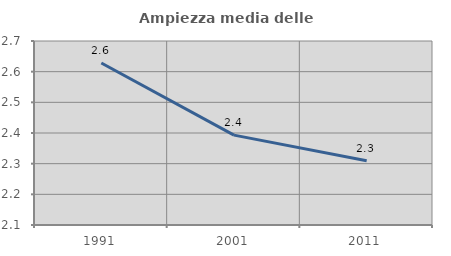
| Category | Ampiezza media delle famiglie |
|---|---|
| 1991.0 | 2.628 |
| 2001.0 | 2.393 |
| 2011.0 | 2.31 |